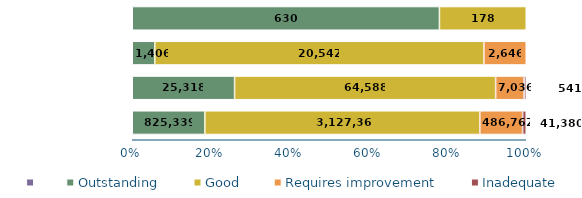
| Category | Series 1 | Outstanding | Good | Requires improvement | Inadequate |
|---|---|---|---|---|---|
| Existing places | 0 | 825339 | 3127367 | 486762 | 41380 |
| New places | 0 | 25318 | 64588 | 7036 | 541 |
| Existing places | 0 | 1406 | 20542 | 2646 | 0 |
| New places | 0 | 630 | 178 | 0 | 0 |